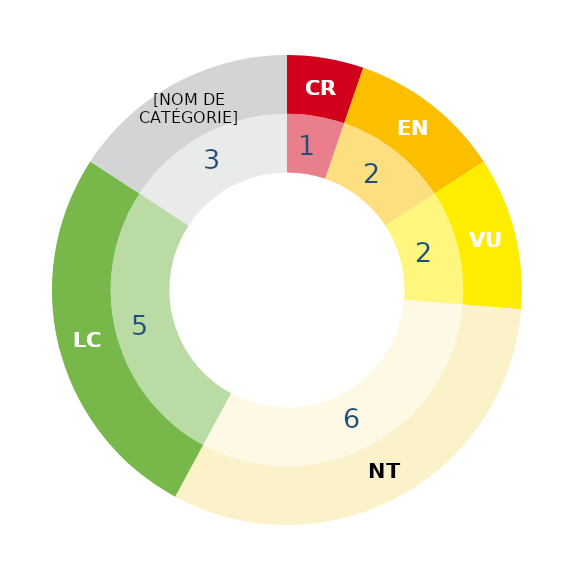
| Category | Series 1 | Series 0 |
|---|---|---|
| RE | 0 | 0 |
| CR | 1 | 1 |
| EN | 2 | 2 |
| VU | 2 | 2 |
| NT | 6 | 6 |
| LC | 5 | 5 |
| DD | 3 | 3 |